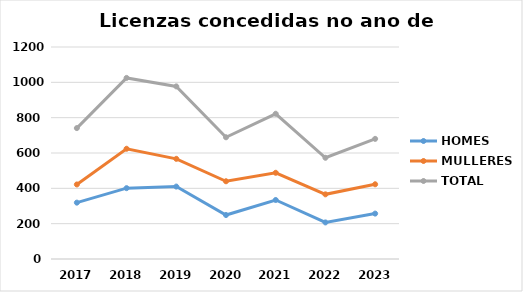
| Category | HOMES | MULLERES | TOTAL |
|---|---|---|---|
| 2017.0 | 319 | 422 | 741 |
| 2018.0 | 401 | 624 | 1025 |
| 2019.0 | 410 | 567 | 977 |
| 2020.0 | 249 | 440 | 689 |
| 2021.0 | 334 | 488 | 822 |
| 2022.0 | 207 | 366 | 573 |
| 2023.0 | 257 | 423 | 680 |